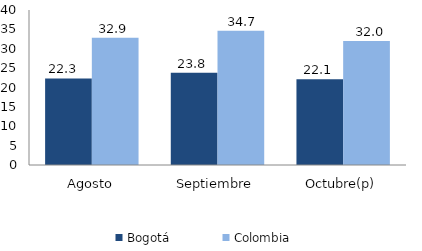
| Category | Bogotá | Colombia |
|---|---|---|
| Agosto | 22.324 | 32.86 |
| Septiembre | 23.829 | 34.656 |
| Octubre(p) | 22.12 | 31.983 |